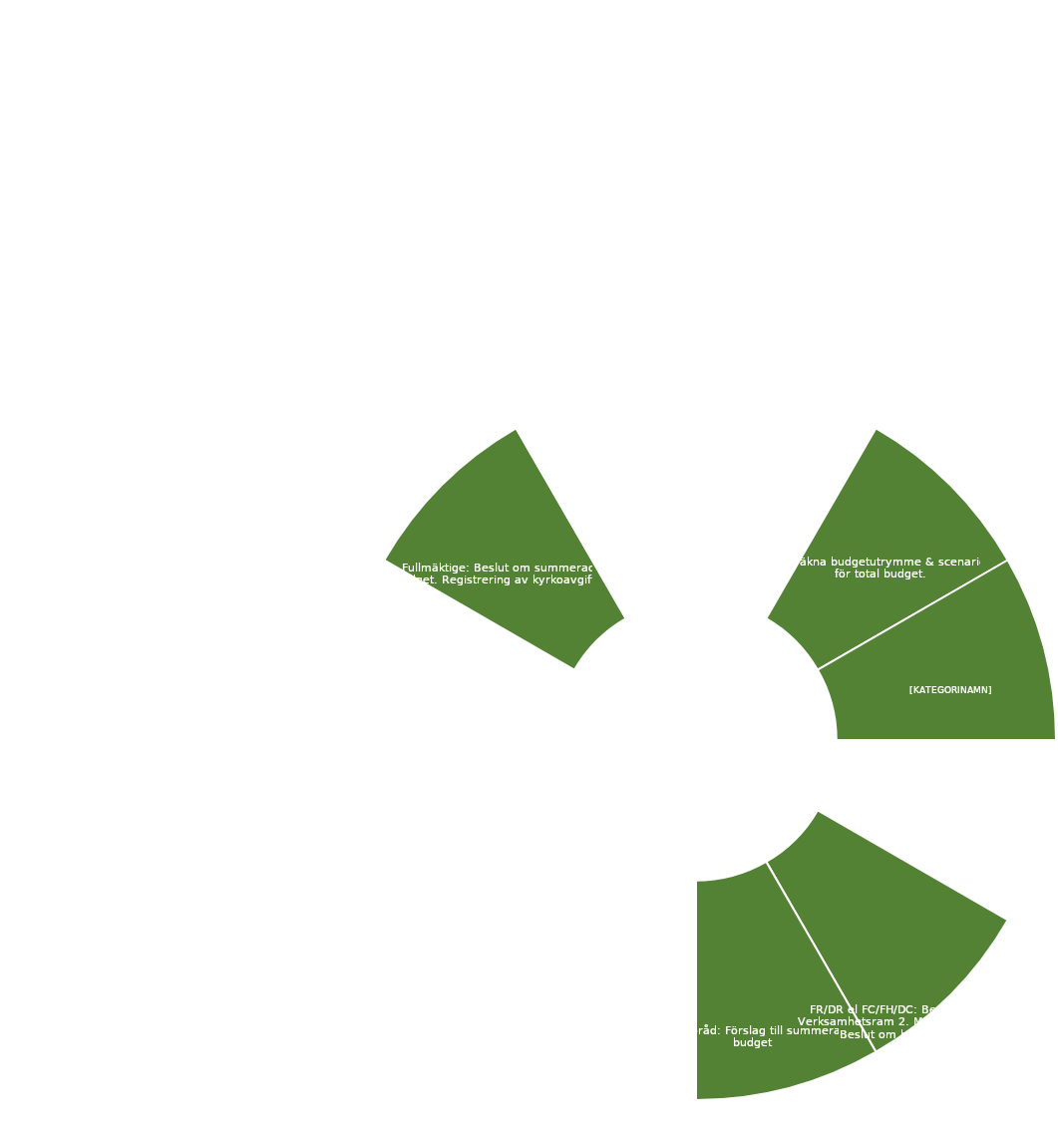
| Category | Series 0 |
|---|---|
|  | 1 |
| Beräkna budgetutrymme & scenarier för total budget.  | 1 |
| Kyrkorådet: Avstämning budgetförutsättningar och beslut om budgetdirektiv. Kyrkorådet: Beslut om Verksamhetsram 1.  | 1 |
|  | 1 |
| FR/DR el FC/FH/DC: Beslut om Verksamhetsram 2. MBL §11/§19 – Beslut om budget.  | 1 |
| Kyrkoråd: Förslag till summerad budget | 1 |
|  | 1 |
|  | 1 |
|  | 1 |
|  | 1 |
| Fullmäktige: Beslut om summerad budget. Registrering av kyrkoavgift.  | 1 |